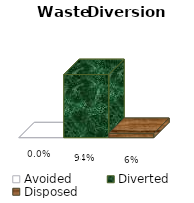
| Category | Avoided | Diverted | Disposed |
|---|---|---|---|
| 0 | 0 | 0.936 | 0.064 |